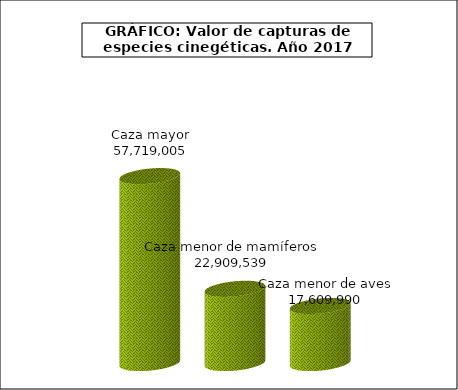
| Category | Cazar |
|---|---|
| Caza mayor | 57719005 |
| Caza menor de mamíferos | 22909539 |
| Caza menor de aves | 17609990.2 |